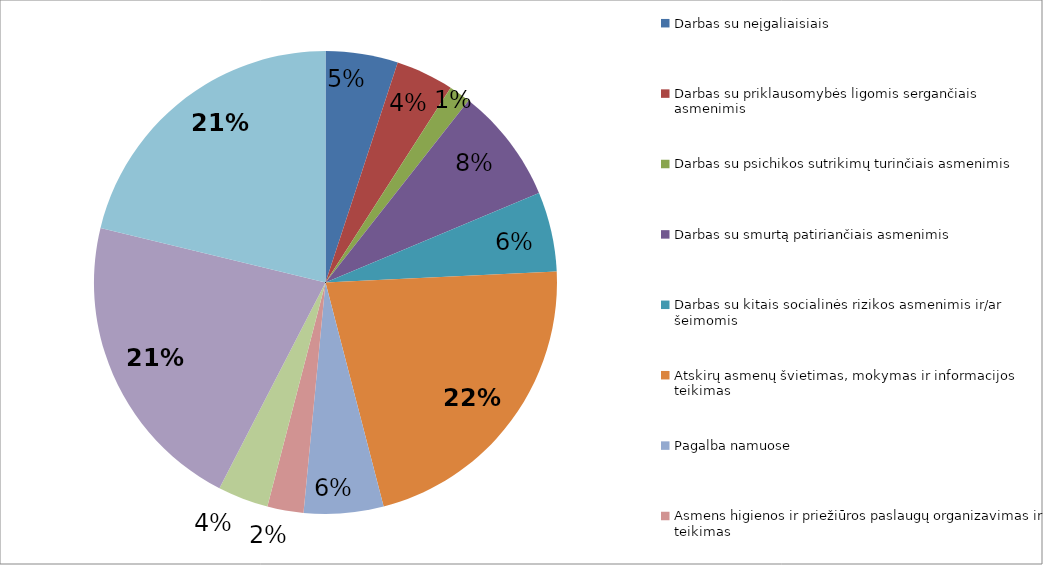
| Category | Series 0 |
|---|---|
| Darbas su neįgaliaisiais | 10 |
| Darbas su priklausomybės ligomis sergančiais asmenimis | 8 |
| Darbas su psichikos sutrikimų turinčiais asmenimis | 3 |
| Darbas su smurtą patiriančiais asmenimis | 16 |
| Darbas su kitais socialinės rizikos asmenimis ir/ar šeimomis | 11 |
| Atskirų asmenų švietimas, mokymas ir informacijos teikimas | 43 |
| Pagalba namuose | 11 |
| Asmens higienos ir priežiūros paslaugų organizavimas ir teikimas | 5 |
| Transporto organizavimo paslaugos (asmenims turintiems judėjimo negalią, ligoniams, vaikams ir kt.) | 7 |
| Atskiros bendruomeninės iniciatyvos (pvz., savipagalbos grupių veikla, pagalbos ir/ar informacijos telefonu/el. paštu teikimas, meno/sporto/verslo srities ar kitu bendru interesu paremtų asociacijų ir klubų veikla, kt.) | 42 |
| Renginių organizavimas, sociokultūrinės paslaugos | 42 |